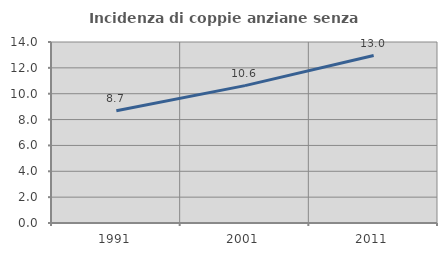
| Category | Incidenza di coppie anziane senza figli  |
|---|---|
| 1991.0 | 8.682 |
| 2001.0 | 10.626 |
| 2011.0 | 12.95 |